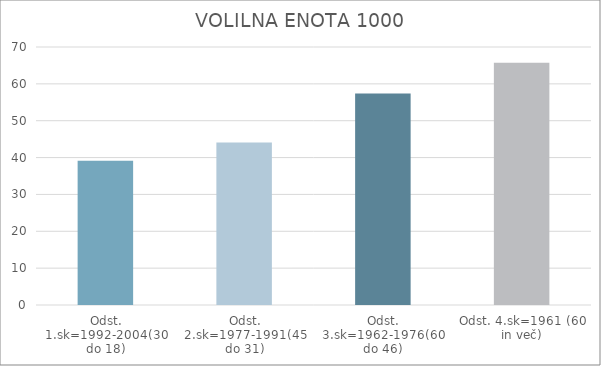
| Category | Series 0 |
|---|---|
| Odst. 1.sk=1992-2004(30 do 18) | 39.14 |
| Odst. 2.sk=1977-1991(45 do 31) | 44.09 |
| Odst. 3.sk=1962-1976(60 do 46) | 57.41 |
| Odst. 4.sk=1961 (60 in več) | 65.71 |